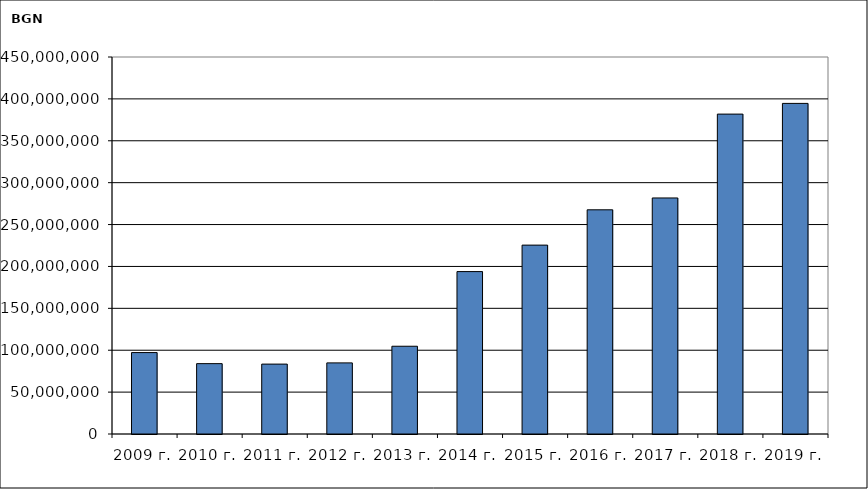
| Category | Series 0 |
|---|---|
| 2009 г. | 97201488.723 |
| 2010 г. | 83991914.008 |
| 2011 г. | 83436121.79 |
| 2012 г. | 84879991.412 |
| 2013 г. | 104754870.79 |
| 2014 г. | 193869580.188 |
| 2015 г. | 225460313.7 |
| 2016 г. | 267607430.706 |
| 2017 г. | 281740406.295 |
| 2018 г. | 381845304.135 |
| 2019 г. | 394620175.745 |